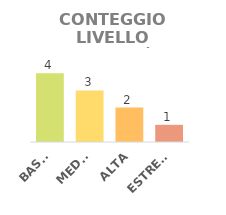
| Category | QT.À |
|---|---|
| BASSA | 4 |
| MEDIA | 3 |
| ALTA | 2 |
| ESTREMA | 1 |